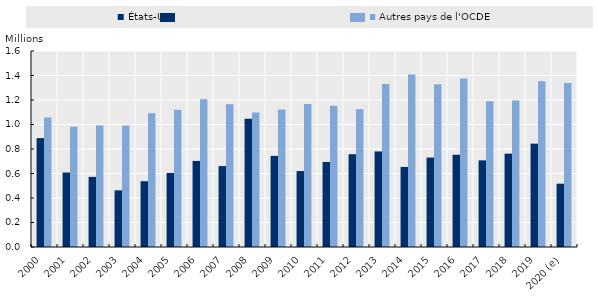
| Category | États-Unis | Autres pays de l'OCDE |
|---|---|---|
| 2000 | 888788 | 1057028 |
| 2001 | 608205 | 982011 |
| 2002 | 572646 | 992904 |
| 2003 | 462435 | 991524 |
| 2004 | 537151 | 1091419 |
| 2005 | 604280 | 1120020 |
| 2006 | 702589 | 1205206 |
| 2007 | 660477 | 1164602 |
| 2008 | 1046539 | 1098400 |
| 2009 | 743715 | 1122161 |
| 2010 | 619913 | 1168333 |
| 2011 | 694193 | 1153356 |
| 2012 | 757434 | 1123850 |
| 2013 | 779929 | 1330996 |
| 2014 | 653416 | 1409148 |
| 2015 | 730259 | 1328246 |
| 2016 | 753060 | 1375363 |
| 2017 | 707265 | 1190165 |
| 2018 | 761901 | 1196204 |
| 2019 | 843593 | 1353029 |
| 2020 (e) | 516805.221 | 1338398.651 |